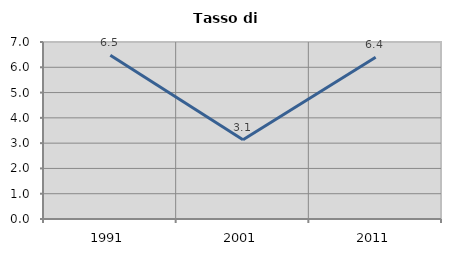
| Category | Tasso di disoccupazione   |
|---|---|
| 1991.0 | 6.474 |
| 2001.0 | 3.137 |
| 2011.0 | 6.397 |